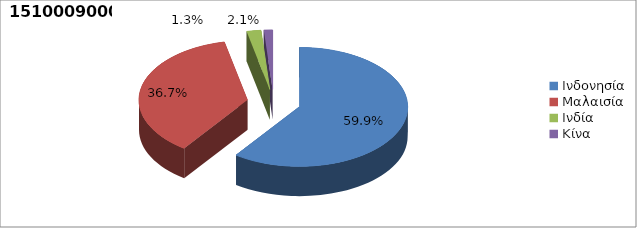
| Category | Series 0 |
|---|---|
| Ινδονησία | 0.599 |
| Μαλαισία | 0.367 |
| Ινδία | 0.021 |
| Κίνα | 0.013 |